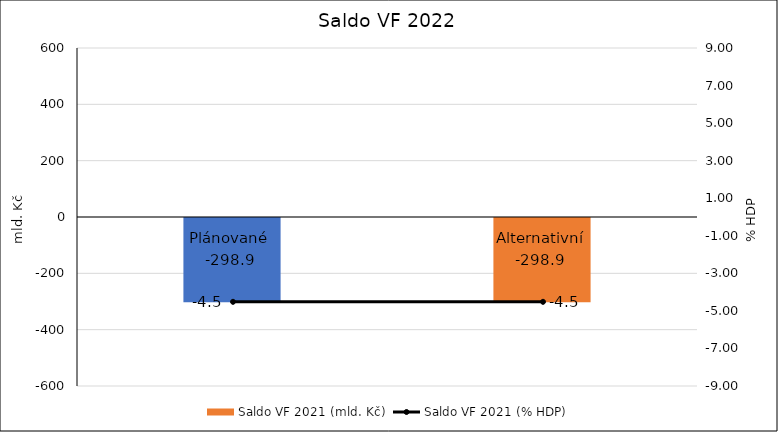
| Category | Saldo VF 2021 (mld. Kč) |
|---|---|
| Plánované  | -298.927 |
| Alternativní | -298.929 |